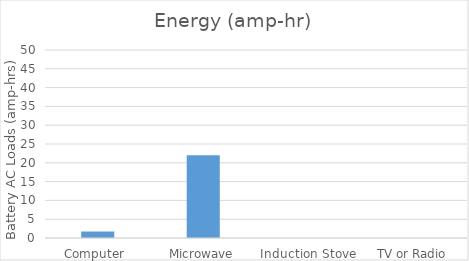
| Category | Energy (amp-hr) |
|---|---|
| Computer  | 1.76 |
| Microwave | 22 |
| Induction Stove | 0 |
| TV or Radio | 0 |